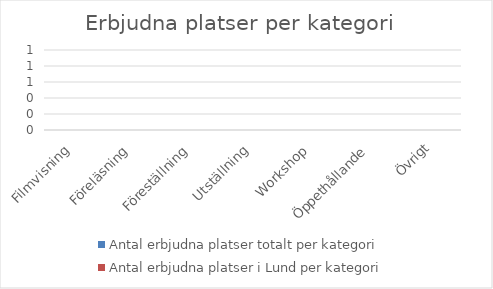
| Category | Antal erbjudna platser totalt per kategori | Antal erbjudna platser i Lund per kategori |
|---|---|---|
| Filmvisning | 0 | 0 |
| Föreläsning | 0 | 0 |
| Föreställning | 0 | 0 |
| Utställning | 0 | 0 |
| Workshop | 0 | 0 |
| Öppethållande | 0 | 0 |
| Övrigt | 0 | 0 |